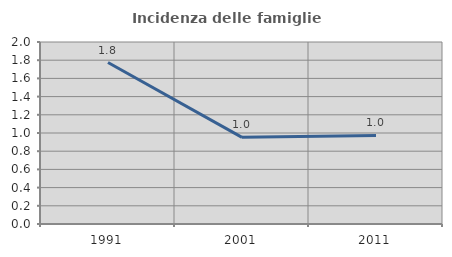
| Category | Incidenza delle famiglie numerose |
|---|---|
| 1991.0 | 1.774 |
| 2001.0 | 0.952 |
| 2011.0 | 0.973 |